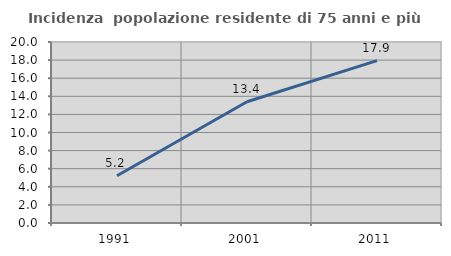
| Category | Incidenza  popolazione residente di 75 anni e più |
|---|---|
| 1991.0 | 5.217 |
| 2001.0 | 13.393 |
| 2011.0 | 17.949 |